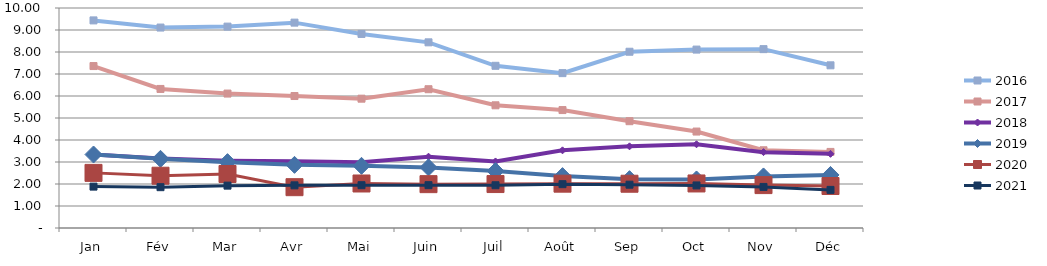
| Category | 2015 | 2016 | 2017 | 2018 | 2019 | 2020 | 2021 |
|---|---|---|---|---|---|---|---|
| Jan |  | 9.436 | 7.361 | 3.34 | 3.341 | 2.506 | 1.881 |
| Fév |  | 9.111 | 6.321 | 3.159 | 3.145 | 2.376 | 1.856 |
| Mar |  | 9.154 | 6.111 | 3.062 | 2.994 | 2.455 | 1.926 |
| Avr |  | 9.335 | 5.999 | 3.031 | 2.87 | 1.855 | 1.939 |
| Mai |  | 8.821 | 5.878 | 2.984 | 2.827 | 2.023 | 1.946 |
| Juin |  | 8.439 | 6.309 | 3.242 | 2.755 | 1.993 | 1.947 |
| Juil |  | 7.373 | 5.577 | 3.025 | 2.589 | 1.998 | 1.943 |
| Août |  | 7.04 | 5.36 | 3.53 | 2.359 | 2.015 | 1.992 |
| Sep |  | 8.012 | 4.855 | 3.712 | 2.22 | 2.012 | 1.968 |
| Oct |  | 8.109 | 4.384 | 3.806 | 2.206 | 2.024 | 1.935 |
| Nov |  | 8.13 | 3.533 | 3.449 | 2.343 | 1.95 | 1.867 |
| Déc |  | 7.395 | 3.458 | 3.371 | 2.411 | 1.909 | 1.733 |